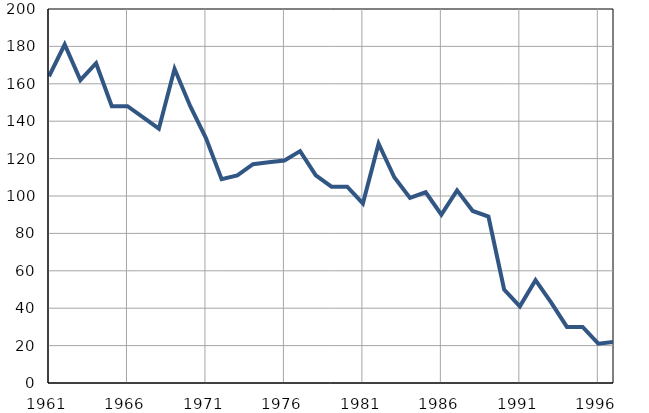
| Category | Умрла 
одојчад |
|---|---|
| 1961.0 | 164 |
| 1962.0 | 181 |
| 1963.0 | 162 |
| 1964.0 | 171 |
| 1965.0 | 148 |
| 1966.0 | 148 |
| 1967.0 | 142 |
| 1968.0 | 136 |
| 1969.0 | 168 |
| 1970.0 | 148 |
| 1971.0 | 131 |
| 1972.0 | 109 |
| 1973.0 | 111 |
| 1974.0 | 117 |
| 1975.0 | 118 |
| 1976.0 | 119 |
| 1977.0 | 124 |
| 1978.0 | 111 |
| 1979.0 | 105 |
| 1980.0 | 105 |
| 1981.0 | 96 |
| 1982.0 | 128 |
| 1983.0 | 110 |
| 1984.0 | 99 |
| 1985.0 | 102 |
| 1986.0 | 90 |
| 1987.0 | 103 |
| 1988.0 | 92 |
| 1989.0 | 89 |
| 1990.0 | 50 |
| 1991.0 | 41 |
| 1992.0 | 55 |
| 1993.0 | 43 |
| 1994.0 | 30 |
| 1995.0 | 30 |
| 1996.0 | 21 |
| 1997.0 | 22 |